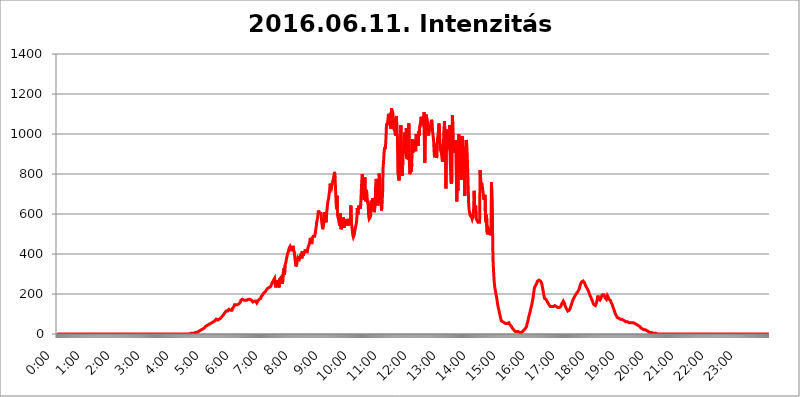
| Category | 2016.06.11. Intenzitás [W/m^2] |
|---|---|
| 0.0 | 0 |
| 0.0006944444444444445 | 0 |
| 0.001388888888888889 | 0 |
| 0.0020833333333333333 | 0 |
| 0.002777777777777778 | 0 |
| 0.003472222222222222 | 0 |
| 0.004166666666666667 | 0 |
| 0.004861111111111111 | 0 |
| 0.005555555555555556 | 0 |
| 0.0062499999999999995 | 0 |
| 0.006944444444444444 | 0 |
| 0.007638888888888889 | 0 |
| 0.008333333333333333 | 0 |
| 0.009027777777777779 | 0 |
| 0.009722222222222222 | 0 |
| 0.010416666666666666 | 0 |
| 0.011111111111111112 | 0 |
| 0.011805555555555555 | 0 |
| 0.012499999999999999 | 0 |
| 0.013194444444444444 | 0 |
| 0.013888888888888888 | 0 |
| 0.014583333333333332 | 0 |
| 0.015277777777777777 | 0 |
| 0.015972222222222224 | 0 |
| 0.016666666666666666 | 0 |
| 0.017361111111111112 | 0 |
| 0.018055555555555557 | 0 |
| 0.01875 | 0 |
| 0.019444444444444445 | 0 |
| 0.02013888888888889 | 0 |
| 0.020833333333333332 | 0 |
| 0.02152777777777778 | 0 |
| 0.022222222222222223 | 0 |
| 0.02291666666666667 | 0 |
| 0.02361111111111111 | 0 |
| 0.024305555555555556 | 0 |
| 0.024999999999999998 | 0 |
| 0.025694444444444447 | 0 |
| 0.02638888888888889 | 0 |
| 0.027083333333333334 | 0 |
| 0.027777777777777776 | 0 |
| 0.02847222222222222 | 0 |
| 0.029166666666666664 | 0 |
| 0.029861111111111113 | 0 |
| 0.030555555555555555 | 0 |
| 0.03125 | 0 |
| 0.03194444444444445 | 0 |
| 0.03263888888888889 | 0 |
| 0.03333333333333333 | 0 |
| 0.034027777777777775 | 0 |
| 0.034722222222222224 | 0 |
| 0.035416666666666666 | 0 |
| 0.036111111111111115 | 0 |
| 0.03680555555555556 | 0 |
| 0.0375 | 0 |
| 0.03819444444444444 | 0 |
| 0.03888888888888889 | 0 |
| 0.03958333333333333 | 0 |
| 0.04027777777777778 | 0 |
| 0.04097222222222222 | 0 |
| 0.041666666666666664 | 0 |
| 0.042361111111111106 | 0 |
| 0.04305555555555556 | 0 |
| 0.043750000000000004 | 0 |
| 0.044444444444444446 | 0 |
| 0.04513888888888889 | 0 |
| 0.04583333333333334 | 0 |
| 0.04652777777777778 | 0 |
| 0.04722222222222222 | 0 |
| 0.04791666666666666 | 0 |
| 0.04861111111111111 | 0 |
| 0.049305555555555554 | 0 |
| 0.049999999999999996 | 0 |
| 0.05069444444444445 | 0 |
| 0.051388888888888894 | 0 |
| 0.052083333333333336 | 0 |
| 0.05277777777777778 | 0 |
| 0.05347222222222222 | 0 |
| 0.05416666666666667 | 0 |
| 0.05486111111111111 | 0 |
| 0.05555555555555555 | 0 |
| 0.05625 | 0 |
| 0.05694444444444444 | 0 |
| 0.057638888888888885 | 0 |
| 0.05833333333333333 | 0 |
| 0.05902777777777778 | 0 |
| 0.059722222222222225 | 0 |
| 0.06041666666666667 | 0 |
| 0.061111111111111116 | 0 |
| 0.06180555555555556 | 0 |
| 0.0625 | 0 |
| 0.06319444444444444 | 0 |
| 0.06388888888888888 | 0 |
| 0.06458333333333334 | 0 |
| 0.06527777777777778 | 0 |
| 0.06597222222222222 | 0 |
| 0.06666666666666667 | 0 |
| 0.06736111111111111 | 0 |
| 0.06805555555555555 | 0 |
| 0.06874999999999999 | 0 |
| 0.06944444444444443 | 0 |
| 0.07013888888888889 | 0 |
| 0.07083333333333333 | 0 |
| 0.07152777777777779 | 0 |
| 0.07222222222222223 | 0 |
| 0.07291666666666667 | 0 |
| 0.07361111111111111 | 0 |
| 0.07430555555555556 | 0 |
| 0.075 | 0 |
| 0.07569444444444444 | 0 |
| 0.0763888888888889 | 0 |
| 0.07708333333333334 | 0 |
| 0.07777777777777778 | 0 |
| 0.07847222222222222 | 0 |
| 0.07916666666666666 | 0 |
| 0.0798611111111111 | 0 |
| 0.08055555555555556 | 0 |
| 0.08125 | 0 |
| 0.08194444444444444 | 0 |
| 0.08263888888888889 | 0 |
| 0.08333333333333333 | 0 |
| 0.08402777777777777 | 0 |
| 0.08472222222222221 | 0 |
| 0.08541666666666665 | 0 |
| 0.08611111111111112 | 0 |
| 0.08680555555555557 | 0 |
| 0.08750000000000001 | 0 |
| 0.08819444444444445 | 0 |
| 0.08888888888888889 | 0 |
| 0.08958333333333333 | 0 |
| 0.09027777777777778 | 0 |
| 0.09097222222222222 | 0 |
| 0.09166666666666667 | 0 |
| 0.09236111111111112 | 0 |
| 0.09305555555555556 | 0 |
| 0.09375 | 0 |
| 0.09444444444444444 | 0 |
| 0.09513888888888888 | 0 |
| 0.09583333333333333 | 0 |
| 0.09652777777777777 | 0 |
| 0.09722222222222222 | 0 |
| 0.09791666666666667 | 0 |
| 0.09861111111111111 | 0 |
| 0.09930555555555555 | 0 |
| 0.09999999999999999 | 0 |
| 0.10069444444444443 | 0 |
| 0.1013888888888889 | 0 |
| 0.10208333333333335 | 0 |
| 0.10277777777777779 | 0 |
| 0.10347222222222223 | 0 |
| 0.10416666666666667 | 0 |
| 0.10486111111111111 | 0 |
| 0.10555555555555556 | 0 |
| 0.10625 | 0 |
| 0.10694444444444444 | 0 |
| 0.1076388888888889 | 0 |
| 0.10833333333333334 | 0 |
| 0.10902777777777778 | 0 |
| 0.10972222222222222 | 0 |
| 0.1111111111111111 | 0 |
| 0.11180555555555556 | 0 |
| 0.11180555555555556 | 0 |
| 0.1125 | 0 |
| 0.11319444444444444 | 0 |
| 0.11388888888888889 | 0 |
| 0.11458333333333333 | 0 |
| 0.11527777777777777 | 0 |
| 0.11597222222222221 | 0 |
| 0.11666666666666665 | 0 |
| 0.1173611111111111 | 0 |
| 0.11805555555555557 | 0 |
| 0.11944444444444445 | 0 |
| 0.12013888888888889 | 0 |
| 0.12083333333333333 | 0 |
| 0.12152777777777778 | 0 |
| 0.12222222222222223 | 0 |
| 0.12291666666666667 | 0 |
| 0.12291666666666667 | 0 |
| 0.12361111111111112 | 0 |
| 0.12430555555555556 | 0 |
| 0.125 | 0 |
| 0.12569444444444444 | 0 |
| 0.12638888888888888 | 0 |
| 0.12708333333333333 | 0 |
| 0.16875 | 0 |
| 0.12847222222222224 | 0 |
| 0.12916666666666668 | 0 |
| 0.12986111111111112 | 0 |
| 0.13055555555555556 | 0 |
| 0.13125 | 0 |
| 0.13194444444444445 | 0 |
| 0.1326388888888889 | 0 |
| 0.13333333333333333 | 0 |
| 0.13402777777777777 | 0 |
| 0.13402777777777777 | 0 |
| 0.13472222222222222 | 0 |
| 0.13541666666666666 | 0 |
| 0.1361111111111111 | 0 |
| 0.13749999999999998 | 0 |
| 0.13819444444444443 | 0 |
| 0.1388888888888889 | 0 |
| 0.13958333333333334 | 0 |
| 0.14027777777777778 | 0 |
| 0.14097222222222222 | 0 |
| 0.14166666666666666 | 0 |
| 0.1423611111111111 | 0 |
| 0.14305555555555557 | 0 |
| 0.14375000000000002 | 0 |
| 0.14444444444444446 | 0 |
| 0.1451388888888889 | 0 |
| 0.1451388888888889 | 0 |
| 0.14652777777777778 | 0 |
| 0.14722222222222223 | 0 |
| 0.14791666666666667 | 0 |
| 0.1486111111111111 | 0 |
| 0.14930555555555555 | 0 |
| 0.15 | 0 |
| 0.15069444444444444 | 0 |
| 0.15138888888888888 | 0 |
| 0.15208333333333332 | 0 |
| 0.15277777777777776 | 0 |
| 0.15347222222222223 | 0 |
| 0.15416666666666667 | 0 |
| 0.15486111111111112 | 0 |
| 0.15555555555555556 | 0 |
| 0.15625 | 0 |
| 0.15694444444444444 | 0 |
| 0.15763888888888888 | 0 |
| 0.15833333333333333 | 0 |
| 0.15902777777777777 | 0 |
| 0.15972222222222224 | 0 |
| 0.16041666666666668 | 0 |
| 0.16111111111111112 | 0 |
| 0.16180555555555556 | 0 |
| 0.1625 | 0 |
| 0.16319444444444445 | 0 |
| 0.1638888888888889 | 0 |
| 0.16458333333333333 | 0 |
| 0.16527777777777777 | 0 |
| 0.16597222222222222 | 0 |
| 0.16666666666666666 | 0 |
| 0.1673611111111111 | 0 |
| 0.16805555555555554 | 0 |
| 0.16874999999999998 | 0 |
| 0.16944444444444443 | 0 |
| 0.17013888888888887 | 0 |
| 0.1708333333333333 | 0 |
| 0.17152777777777775 | 0 |
| 0.17222222222222225 | 0 |
| 0.1729166666666667 | 0 |
| 0.17361111111111113 | 0 |
| 0.17430555555555557 | 0 |
| 0.17500000000000002 | 0 |
| 0.17569444444444446 | 0 |
| 0.1763888888888889 | 0 |
| 0.17708333333333334 | 0 |
| 0.17777777777777778 | 0 |
| 0.17847222222222223 | 0 |
| 0.17916666666666667 | 0 |
| 0.1798611111111111 | 0 |
| 0.18055555555555555 | 0 |
| 0.18125 | 0 |
| 0.18194444444444444 | 0 |
| 0.1826388888888889 | 0 |
| 0.18333333333333335 | 0 |
| 0.1840277777777778 | 0 |
| 0.18472222222222223 | 0 |
| 0.18541666666666667 | 0 |
| 0.18611111111111112 | 0 |
| 0.18680555555555556 | 3.525 |
| 0.1875 | 3.525 |
| 0.18819444444444444 | 3.525 |
| 0.18888888888888888 | 3.525 |
| 0.18958333333333333 | 3.525 |
| 0.19027777777777777 | 3.525 |
| 0.1909722222222222 | 3.525 |
| 0.19166666666666665 | 3.525 |
| 0.19236111111111112 | 3.525 |
| 0.19305555555555554 | 7.887 |
| 0.19375 | 7.887 |
| 0.19444444444444445 | 7.887 |
| 0.1951388888888889 | 7.887 |
| 0.19583333333333333 | 7.887 |
| 0.19652777777777777 | 12.257 |
| 0.19722222222222222 | 12.257 |
| 0.19791666666666666 | 12.257 |
| 0.1986111111111111 | 12.257 |
| 0.19930555555555554 | 16.636 |
| 0.19999999999999998 | 16.636 |
| 0.20069444444444443 | 16.636 |
| 0.20138888888888887 | 21.024 |
| 0.2020833333333333 | 21.024 |
| 0.2027777777777778 | 21.024 |
| 0.2034722222222222 | 21.024 |
| 0.2041666666666667 | 25.419 |
| 0.20486111111111113 | 25.419 |
| 0.20555555555555557 | 29.823 |
| 0.20625000000000002 | 29.823 |
| 0.20694444444444446 | 34.234 |
| 0.2076388888888889 | 34.234 |
| 0.20833333333333334 | 38.653 |
| 0.20902777777777778 | 38.653 |
| 0.20972222222222223 | 43.079 |
| 0.21041666666666667 | 43.079 |
| 0.2111111111111111 | 47.511 |
| 0.21180555555555555 | 47.511 |
| 0.2125 | 47.511 |
| 0.21319444444444444 | 51.951 |
| 0.2138888888888889 | 51.951 |
| 0.21458333333333335 | 51.951 |
| 0.2152777777777778 | 51.951 |
| 0.21597222222222223 | 56.398 |
| 0.21666666666666667 | 56.398 |
| 0.21736111111111112 | 56.398 |
| 0.21805555555555556 | 56.398 |
| 0.21875 | 60.85 |
| 0.21944444444444444 | 65.31 |
| 0.22013888888888888 | 65.31 |
| 0.22083333333333333 | 65.31 |
| 0.22152777777777777 | 69.775 |
| 0.2222222222222222 | 69.775 |
| 0.22291666666666665 | 74.246 |
| 0.2236111111111111 | 69.775 |
| 0.22430555555555556 | 69.775 |
| 0.225 | 69.775 |
| 0.22569444444444445 | 74.246 |
| 0.2263888888888889 | 74.246 |
| 0.22708333333333333 | 74.246 |
| 0.22777777777777777 | 74.246 |
| 0.22847222222222222 | 74.246 |
| 0.22916666666666666 | 78.722 |
| 0.2298611111111111 | 78.722 |
| 0.23055555555555554 | 83.205 |
| 0.23124999999999998 | 87.692 |
| 0.23194444444444443 | 92.184 |
| 0.23263888888888887 | 92.184 |
| 0.2333333333333333 | 96.682 |
| 0.2340277777777778 | 101.184 |
| 0.2347222222222222 | 105.69 |
| 0.2354166666666667 | 110.201 |
| 0.23611111111111113 | 110.201 |
| 0.23680555555555557 | 114.716 |
| 0.23750000000000002 | 114.716 |
| 0.23819444444444446 | 119.235 |
| 0.2388888888888889 | 114.716 |
| 0.23958333333333334 | 114.716 |
| 0.24027777777777778 | 119.235 |
| 0.24097222222222223 | 123.758 |
| 0.24166666666666667 | 119.235 |
| 0.2423611111111111 | 119.235 |
| 0.24305555555555555 | 119.235 |
| 0.24375 | 123.758 |
| 0.24444444444444446 | 123.758 |
| 0.24513888888888888 | 119.235 |
| 0.24583333333333335 | 128.284 |
| 0.2465277777777778 | 132.814 |
| 0.24722222222222223 | 132.814 |
| 0.24791666666666667 | 137.347 |
| 0.24861111111111112 | 146.423 |
| 0.24930555555555556 | 146.423 |
| 0.25 | 146.423 |
| 0.25069444444444444 | 146.423 |
| 0.2513888888888889 | 146.423 |
| 0.2520833333333333 | 146.423 |
| 0.25277777777777777 | 146.423 |
| 0.2534722222222222 | 146.423 |
| 0.25416666666666665 | 150.964 |
| 0.2548611111111111 | 150.964 |
| 0.2555555555555556 | 150.964 |
| 0.25625000000000003 | 155.509 |
| 0.2569444444444445 | 160.056 |
| 0.2576388888888889 | 169.156 |
| 0.25833333333333336 | 173.709 |
| 0.2590277777777778 | 173.709 |
| 0.25972222222222224 | 173.709 |
| 0.2604166666666667 | 173.709 |
| 0.2611111111111111 | 169.156 |
| 0.26180555555555557 | 169.156 |
| 0.2625 | 164.605 |
| 0.26319444444444445 | 169.156 |
| 0.2638888888888889 | 169.156 |
| 0.26458333333333334 | 169.156 |
| 0.2652777777777778 | 169.156 |
| 0.2659722222222222 | 169.156 |
| 0.26666666666666666 | 169.156 |
| 0.2673611111111111 | 169.156 |
| 0.26805555555555555 | 173.709 |
| 0.26875 | 173.709 |
| 0.26944444444444443 | 173.709 |
| 0.2701388888888889 | 173.709 |
| 0.2708333333333333 | 169.156 |
| 0.27152777777777776 | 169.156 |
| 0.2722222222222222 | 169.156 |
| 0.27291666666666664 | 169.156 |
| 0.2736111111111111 | 164.605 |
| 0.2743055555555555 | 160.056 |
| 0.27499999999999997 | 155.509 |
| 0.27569444444444446 | 160.056 |
| 0.27638888888888885 | 164.605 |
| 0.27708333333333335 | 164.605 |
| 0.2777777777777778 | 164.605 |
| 0.27847222222222223 | 164.605 |
| 0.2791666666666667 | 160.056 |
| 0.2798611111111111 | 155.509 |
| 0.28055555555555556 | 160.056 |
| 0.28125 | 164.605 |
| 0.28194444444444444 | 169.156 |
| 0.2826388888888889 | 169.156 |
| 0.2833333333333333 | 173.709 |
| 0.28402777777777777 | 178.264 |
| 0.2847222222222222 | 169.156 |
| 0.28541666666666665 | 178.264 |
| 0.28611111111111115 | 187.378 |
| 0.28680555555555554 | 191.937 |
| 0.28750000000000003 | 191.937 |
| 0.2881944444444445 | 196.497 |
| 0.2888888888888889 | 201.058 |
| 0.28958333333333336 | 205.62 |
| 0.2902777777777778 | 210.182 |
| 0.29097222222222224 | 210.182 |
| 0.2916666666666667 | 210.182 |
| 0.2923611111111111 | 210.182 |
| 0.29305555555555557 | 219.309 |
| 0.29375 | 219.309 |
| 0.29444444444444445 | 223.873 |
| 0.2951388888888889 | 228.436 |
| 0.29583333333333334 | 233 |
| 0.2965277777777778 | 233 |
| 0.2972222222222222 | 233 |
| 0.29791666666666666 | 233 |
| 0.2986111111111111 | 233 |
| 0.29930555555555555 | 237.564 |
| 0.3 | 242.127 |
| 0.30069444444444443 | 251.251 |
| 0.3013888888888889 | 255.813 |
| 0.3020833333333333 | 260.373 |
| 0.30277777777777776 | 264.932 |
| 0.3034722222222222 | 269.49 |
| 0.30416666666666664 | 274.047 |
| 0.3048611111111111 | 278.603 |
| 0.3055555555555555 | 274.047 |
| 0.30624999999999997 | 233 |
| 0.3069444444444444 | 228.436 |
| 0.3076388888888889 | 269.49 |
| 0.30833333333333335 | 255.813 |
| 0.3090277777777778 | 264.932 |
| 0.30972222222222223 | 264.932 |
| 0.3104166666666667 | 269.49 |
| 0.3111111111111111 | 233 |
| 0.31180555555555556 | 274.047 |
| 0.3125 | 274.047 |
| 0.31319444444444444 | 278.603 |
| 0.3138888888888889 | 283.156 |
| 0.3145833333333333 | 269.49 |
| 0.31527777777777777 | 269.49 |
| 0.3159722222222222 | 251.251 |
| 0.31666666666666665 | 296.808 |
| 0.31736111111111115 | 314.98 |
| 0.31805555555555554 | 328.584 |
| 0.31875000000000003 | 296.808 |
| 0.3194444444444445 | 342.162 |
| 0.3201388888888889 | 346.682 |
| 0.32083333333333336 | 360.221 |
| 0.3215277777777778 | 378.224 |
| 0.32222222222222224 | 387.202 |
| 0.3229166666666667 | 400.638 |
| 0.3236111111111111 | 400.638 |
| 0.32430555555555557 | 414.035 |
| 0.325 | 427.39 |
| 0.32569444444444445 | 427.39 |
| 0.3263888888888889 | 436.27 |
| 0.32708333333333334 | 427.39 |
| 0.3277777777777778 | 414.035 |
| 0.3284722222222222 | 427.39 |
| 0.32916666666666666 | 418.492 |
| 0.3298611111111111 | 422.943 |
| 0.33055555555555555 | 440.702 |
| 0.33125 | 427.39 |
| 0.33194444444444443 | 427.39 |
| 0.3326388888888889 | 405.108 |
| 0.3333333333333333 | 378.224 |
| 0.3340277777777778 | 382.715 |
| 0.3347222222222222 | 337.639 |
| 0.3354166666666667 | 342.162 |
| 0.3361111111111111 | 351.198 |
| 0.3368055555555556 | 373.729 |
| 0.33749999999999997 | 382.715 |
| 0.33819444444444446 | 382.715 |
| 0.33888888888888885 | 378.224 |
| 0.33958333333333335 | 373.729 |
| 0.34027777777777773 | 373.729 |
| 0.34097222222222223 | 373.729 |
| 0.3416666666666666 | 396.164 |
| 0.3423611111111111 | 405.108 |
| 0.3430555555555555 | 378.224 |
| 0.34375 | 414.035 |
| 0.3444444444444445 | 414.035 |
| 0.3451388888888889 | 391.685 |
| 0.3458333333333334 | 405.108 |
| 0.34652777777777777 | 405.108 |
| 0.34722222222222227 | 414.035 |
| 0.34791666666666665 | 422.943 |
| 0.34861111111111115 | 409.574 |
| 0.34930555555555554 | 418.492 |
| 0.35000000000000003 | 405.108 |
| 0.3506944444444444 | 418.492 |
| 0.3513888888888889 | 422.943 |
| 0.3520833333333333 | 436.27 |
| 0.3527777777777778 | 440.702 |
| 0.3534722222222222 | 449.551 |
| 0.3541666666666667 | 458.38 |
| 0.3548611111111111 | 480.356 |
| 0.35555555555555557 | 471.582 |
| 0.35625 | 462.786 |
| 0.35694444444444445 | 449.551 |
| 0.3576388888888889 | 480.356 |
| 0.35833333333333334 | 484.735 |
| 0.3590277777777778 | 489.108 |
| 0.3597222222222222 | 489.108 |
| 0.36041666666666666 | 484.735 |
| 0.3611111111111111 | 489.108 |
| 0.36180555555555555 | 502.192 |
| 0.3625 | 506.542 |
| 0.36319444444444443 | 536.82 |
| 0.3638888888888889 | 558.261 |
| 0.3645833333333333 | 558.261 |
| 0.3652777777777778 | 583.779 |
| 0.3659722222222222 | 609.062 |
| 0.3666666666666667 | 617.436 |
| 0.3673611111111111 | 600.661 |
| 0.3680555555555556 | 609.062 |
| 0.36874999999999997 | 596.45 |
| 0.36944444444444446 | 609.062 |
| 0.37013888888888885 | 596.45 |
| 0.37083333333333335 | 562.53 |
| 0.37152777777777773 | 545.416 |
| 0.37222222222222223 | 523.88 |
| 0.3729166666666666 | 523.88 |
| 0.3736111111111111 | 553.986 |
| 0.3743055555555555 | 575.299 |
| 0.375 | 609.062 |
| 0.3756944444444445 | 600.661 |
| 0.3763888888888889 | 571.049 |
| 0.3770833333333334 | 558.261 |
| 0.37777777777777777 | 600.661 |
| 0.37847222222222227 | 625.784 |
| 0.37916666666666665 | 650.667 |
| 0.37986111111111115 | 667.123 |
| 0.38055555555555554 | 675.311 |
| 0.38125000000000003 | 699.717 |
| 0.3819444444444444 | 711.832 |
| 0.3826388888888889 | 751.803 |
| 0.3833333333333333 | 751.803 |
| 0.3840277777777778 | 747.834 |
| 0.3847222222222222 | 731.896 |
| 0.3854166666666667 | 735.89 |
| 0.3861111111111111 | 759.723 |
| 0.38680555555555557 | 759.723 |
| 0.3875 | 779.42 |
| 0.38819444444444445 | 795.074 |
| 0.3888888888888889 | 810.641 |
| 0.38958333333333334 | 779.42 |
| 0.3902777777777778 | 731.896 |
| 0.3909722222222222 | 663.019 |
| 0.39166666666666666 | 625.784 |
| 0.3923611111111111 | 691.608 |
| 0.39305555555555555 | 596.45 |
| 0.39375 | 583.779 |
| 0.39444444444444443 | 575.299 |
| 0.3951388888888889 | 558.261 |
| 0.3958333333333333 | 553.986 |
| 0.3965277777777778 | 541.121 |
| 0.3972222222222222 | 604.864 |
| 0.3979166666666667 | 523.88 |
| 0.3986111111111111 | 528.2 |
| 0.3993055555555556 | 528.2 |
| 0.39999999999999997 | 545.416 |
| 0.40069444444444446 | 549.704 |
| 0.40138888888888885 | 583.779 |
| 0.40208333333333335 | 532.513 |
| 0.40277777777777773 | 536.82 |
| 0.40347222222222223 | 545.416 |
| 0.4041666666666666 | 558.261 |
| 0.4048611111111111 | 566.793 |
| 0.4055555555555555 | 575.299 |
| 0.40625 | 562.53 |
| 0.4069444444444445 | 558.261 |
| 0.4076388888888889 | 541.121 |
| 0.4083333333333334 | 536.82 |
| 0.40902777777777777 | 541.121 |
| 0.40972222222222227 | 575.299 |
| 0.41041666666666665 | 562.53 |
| 0.41111111111111115 | 571.049 |
| 0.41180555555555554 | 642.4 |
| 0.41250000000000003 | 549.704 |
| 0.4131944444444444 | 541.121 |
| 0.4138888888888889 | 541.121 |
| 0.4145833333333333 | 493.475 |
| 0.4152777777777778 | 484.735 |
| 0.4159722222222222 | 489.108 |
| 0.4166666666666667 | 497.836 |
| 0.4173611111111111 | 515.223 |
| 0.41805555555555557 | 528.2 |
| 0.41875 | 541.121 |
| 0.41944444444444445 | 553.986 |
| 0.4201388888888889 | 575.299 |
| 0.42083333333333334 | 629.948 |
| 0.4215277777777778 | 596.45 |
| 0.4222222222222222 | 613.252 |
| 0.42291666666666666 | 642.4 |
| 0.4236111111111111 | 625.784 |
| 0.42430555555555555 | 638.256 |
| 0.425 | 625.784 |
| 0.42569444444444443 | 650.667 |
| 0.4263888888888889 | 711.832 |
| 0.4270833333333333 | 763.674 |
| 0.4277777777777778 | 798.974 |
| 0.4284722222222222 | 798.974 |
| 0.4291666666666667 | 739.877 |
| 0.4298611111111111 | 683.473 |
| 0.4305555555555556 | 671.22 |
| 0.43124999999999997 | 783.342 |
| 0.43194444444444446 | 755.766 |
| 0.43263888888888885 | 663.019 |
| 0.43333333333333335 | 719.877 |
| 0.43402777777777773 | 711.832 |
| 0.43472222222222223 | 675.311 |
| 0.4354166666666666 | 654.791 |
| 0.4361111111111111 | 642.4 |
| 0.4368055555555555 | 588.009 |
| 0.4375 | 575.299 |
| 0.4381944444444445 | 575.299 |
| 0.4388888888888889 | 583.779 |
| 0.4395833333333334 | 592.233 |
| 0.44027777777777777 | 667.123 |
| 0.44097222222222227 | 629.948 |
| 0.44166666666666665 | 617.436 |
| 0.44236111111111115 | 679.395 |
| 0.44305555555555554 | 667.123 |
| 0.44375000000000003 | 638.256 |
| 0.4444444444444444 | 609.062 |
| 0.4451388888888889 | 621.613 |
| 0.4458333333333333 | 642.4 |
| 0.4465277777777778 | 735.89 |
| 0.4472222222222222 | 775.492 |
| 0.4479166666666667 | 775.492 |
| 0.4486111111111111 | 735.89 |
| 0.44930555555555557 | 642.4 |
| 0.45 | 658.909 |
| 0.45069444444444445 | 671.22 |
| 0.4513888888888889 | 802.868 |
| 0.45208333333333334 | 787.258 |
| 0.4527777777777778 | 727.896 |
| 0.4534722222222222 | 658.909 |
| 0.45416666666666666 | 642.4 |
| 0.4548611111111111 | 617.436 |
| 0.45555555555555555 | 671.22 |
| 0.45625 | 691.608 |
| 0.45694444444444443 | 829.981 |
| 0.4576388888888889 | 860.676 |
| 0.4583333333333333 | 902.447 |
| 0.4590277777777778 | 932.576 |
| 0.4597222222222222 | 925.06 |
| 0.4604166666666667 | 940.082 |
| 0.4611111111111111 | 984.98 |
| 0.4618055555555556 | 1052.255 |
| 0.46249999999999997 | 1044.762 |
| 0.46319444444444446 | 1052.255 |
| 0.46388888888888885 | 1074.789 |
| 0.46458333333333335 | 1101.226 |
| 0.46527777777777773 | 1097.437 |
| 0.46597222222222223 | 1074.789 |
| 0.4666666666666666 | 1097.437 |
| 0.4673611111111111 | 1033.537 |
| 0.4680555555555555 | 1026.06 |
| 0.46875 | 1127.879 |
| 0.4694444444444445 | 1127.879 |
| 0.4701388888888889 | 1127.879 |
| 0.4708333333333334 | 1101.226 |
| 0.47152777777777777 | 1033.537 |
| 0.47222222222222227 | 1033.537 |
| 0.47291666666666665 | 1014.852 |
| 0.47361111111111115 | 1048.508 |
| 0.47430555555555554 | 992.448 |
| 0.47500000000000003 | 1082.324 |
| 0.4756944444444444 | 1089.873 |
| 0.4763888888888889 | 1011.118 |
| 0.4770833333333333 | 988.714 |
| 0.4777777777777778 | 806.757 |
| 0.4784722222222222 | 806.757 |
| 0.4791666666666667 | 767.62 |
| 0.4798611111111111 | 779.42 |
| 0.48055555555555557 | 837.682 |
| 0.48125 | 898.668 |
| 0.48194444444444445 | 1044.762 |
| 0.4826388888888889 | 853.029 |
| 0.48333333333333334 | 868.305 |
| 0.4840277777777778 | 791.169 |
| 0.4847222222222222 | 887.309 |
| 0.48541666666666666 | 898.668 |
| 0.4861111111111111 | 940.082 |
| 0.48680555555555555 | 943.832 |
| 0.4875 | 1007.383 |
| 0.48819444444444443 | 928.819 |
| 0.4888888888888889 | 977.508 |
| 0.4895833333333333 | 1029.798 |
| 0.4902777777777778 | 875.918 |
| 0.4909722222222222 | 921.298 |
| 0.4916666666666667 | 917.534 |
| 0.4923611111111111 | 872.114 |
| 0.4930555555555556 | 1052.255 |
| 0.49374999999999997 | 875.918 |
| 0.49444444444444446 | 798.974 |
| 0.49513888888888885 | 798.974 |
| 0.49583333333333335 | 818.392 |
| 0.49652777777777773 | 810.641 |
| 0.49722222222222223 | 849.199 |
| 0.4979166666666666 | 973.772 |
| 0.4986111111111111 | 906.223 |
| 0.4993055555555555 | 921.298 |
| 0.5 | 962.555 |
| 0.5006944444444444 | 970.034 |
| 0.5013888888888889 | 932.576 |
| 0.5020833333333333 | 921.298 |
| 0.5027777777777778 | 913.766 |
| 0.5034722222222222 | 999.916 |
| 0.5041666666666667 | 977.508 |
| 0.5048611111111111 | 992.448 |
| 0.5055555555555555 | 981.244 |
| 0.50625 | 940.082 |
| 0.5069444444444444 | 1014.852 |
| 0.5076388888888889 | 992.448 |
| 0.5083333333333333 | 1037.277 |
| 0.5090277777777777 | 1048.508 |
| 0.5097222222222222 | 1063.51 |
| 0.5104166666666666 | 1086.097 |
| 0.5111111111111112 | 1059.756 |
| 0.5118055555555555 | 1052.255 |
| 0.5125000000000001 | 1048.508 |
| 0.5131944444444444 | 1063.51 |
| 0.513888888888889 | 1078.555 |
| 0.5145833333333333 | 1108.816 |
| 0.5152777777777778 | 856.855 |
| 0.5159722222222222 | 879.719 |
| 0.5166666666666667 | 1067.267 |
| 0.517361111111111 | 1097.437 |
| 0.5180555555555556 | 1101.226 |
| 0.5187499999999999 | 1067.267 |
| 0.5194444444444445 | 1059.756 |
| 0.5201388888888888 | 1041.019 |
| 0.5208333333333334 | 992.448 |
| 0.5215277777777778 | 988.714 |
| 0.5222222222222223 | 1041.019 |
| 0.5229166666666667 | 1014.852 |
| 0.5236111111111111 | 1037.277 |
| 0.5243055555555556 | 1059.756 |
| 0.525 | 1071.027 |
| 0.5256944444444445 | 1059.756 |
| 0.5263888888888889 | 1014.852 |
| 0.5270833333333333 | 992.448 |
| 0.5277777777777778 | 970.034 |
| 0.5284722222222222 | 917.534 |
| 0.5291666666666667 | 883.516 |
| 0.5298611111111111 | 925.06 |
| 0.5305555555555556 | 932.576 |
| 0.53125 | 921.298 |
| 0.5319444444444444 | 879.719 |
| 0.5326388888888889 | 894.885 |
| 0.5333333333333333 | 977.508 |
| 0.5340277777777778 | 992.448 |
| 0.5347222222222222 | 1018.587 |
| 0.5354166666666667 | 1052.255 |
| 0.5361111111111111 | 1014.852 |
| 0.5368055555555555 | 958.814 |
| 0.5375 | 921.298 |
| 0.5381944444444444 | 925.06 |
| 0.5388888888888889 | 902.447 |
| 0.5395833333333333 | 906.223 |
| 0.5402777777777777 | 860.676 |
| 0.5409722222222222 | 947.58 |
| 0.5416666666666666 | 955.071 |
| 0.5423611111111112 | 1022.323 |
| 0.5430555555555555 | 1063.51 |
| 0.5437500000000001 | 1059.756 |
| 0.5444444444444444 | 921.298 |
| 0.545138888888889 | 727.896 |
| 0.5458333333333333 | 999.916 |
| 0.5465277777777778 | 1022.323 |
| 0.5472222222222222 | 1022.323 |
| 0.5479166666666667 | 1003.65 |
| 0.548611111111111 | 932.576 |
| 0.5493055555555556 | 936.33 |
| 0.5499999999999999 | 940.082 |
| 0.5506944444444445 | 1044.762 |
| 0.5513888888888888 | 853.029 |
| 0.5520833333333334 | 759.723 |
| 0.5527777777777778 | 751.803 |
| 0.5534722222222223 | 767.62 |
| 0.5541666666666667 | 1093.653 |
| 0.5548611111111111 | 1037.277 |
| 0.5555555555555556 | 970.034 |
| 0.55625 | 906.223 |
| 0.5569444444444445 | 962.555 |
| 0.5576388888888889 | 921.298 |
| 0.5583333333333333 | 970.034 |
| 0.5590277777777778 | 936.33 |
| 0.5597222222222222 | 787.258 |
| 0.5604166666666667 | 663.019 |
| 0.5611111111111111 | 917.534 |
| 0.5618055555555556 | 715.858 |
| 0.5625 | 860.676 |
| 0.5631944444444444 | 999.916 |
| 0.5638888888888889 | 917.534 |
| 0.5645833333333333 | 984.98 |
| 0.5652777777777778 | 822.26 |
| 0.5659722222222222 | 879.719 |
| 0.5666666666666667 | 771.559 |
| 0.5673611111111111 | 898.668 |
| 0.5680555555555555 | 988.714 |
| 0.56875 | 947.58 |
| 0.5694444444444444 | 932.576 |
| 0.5701388888888889 | 795.074 |
| 0.5708333333333333 | 932.576 |
| 0.5715277777777777 | 691.608 |
| 0.5722222222222222 | 818.392 |
| 0.5729166666666666 | 787.258 |
| 0.5736111111111112 | 970.034 |
| 0.5743055555555555 | 947.58 |
| 0.5750000000000001 | 894.885 |
| 0.5756944444444444 | 894.885 |
| 0.576388888888889 | 894.885 |
| 0.5770833333333333 | 642.4 |
| 0.5777777777777778 | 617.436 |
| 0.5784722222222222 | 604.864 |
| 0.5791666666666667 | 592.233 |
| 0.579861111111111 | 592.233 |
| 0.5805555555555556 | 592.233 |
| 0.5812499999999999 | 583.779 |
| 0.5819444444444445 | 575.299 |
| 0.5826388888888888 | 583.779 |
| 0.5833333333333334 | 600.661 |
| 0.5840277777777778 | 625.784 |
| 0.5847222222222223 | 715.858 |
| 0.5854166666666667 | 634.105 |
| 0.5861111111111111 | 617.436 |
| 0.5868055555555556 | 642.4 |
| 0.5875 | 579.542 |
| 0.5881944444444445 | 571.049 |
| 0.5888888888888889 | 571.049 |
| 0.5895833333333333 | 566.793 |
| 0.5902777777777778 | 558.261 |
| 0.5909722222222222 | 553.986 |
| 0.5916666666666667 | 553.986 |
| 0.5923611111111111 | 558.261 |
| 0.5930555555555556 | 818.392 |
| 0.59375 | 783.342 |
| 0.5944444444444444 | 743.859 |
| 0.5951388888888889 | 755.766 |
| 0.5958333333333333 | 743.859 |
| 0.5965277777777778 | 727.896 |
| 0.5972222222222222 | 707.8 |
| 0.5979166666666667 | 683.473 |
| 0.5986111111111111 | 671.22 |
| 0.5993055555555555 | 667.123 |
| 0.6 | 695.666 |
| 0.6006944444444444 | 571.049 |
| 0.6013888888888889 | 558.261 |
| 0.6020833333333333 | 596.45 |
| 0.6027777777777777 | 510.885 |
| 0.6034722222222222 | 497.836 |
| 0.6041666666666666 | 506.542 |
| 0.6048611111111112 | 523.88 |
| 0.6055555555555555 | 523.88 |
| 0.6062500000000001 | 519.555 |
| 0.6069444444444444 | 506.542 |
| 0.607638888888889 | 493.475 |
| 0.6083333333333333 | 515.223 |
| 0.6090277777777778 | 759.723 |
| 0.6097222222222222 | 759.723 |
| 0.6104166666666667 | 558.261 |
| 0.611111111111111 | 378.224 |
| 0.6118055555555556 | 324.052 |
| 0.6124999999999999 | 278.603 |
| 0.6131944444444445 | 246.689 |
| 0.6138888888888888 | 228.436 |
| 0.6145833333333334 | 214.746 |
| 0.6152777777777778 | 201.058 |
| 0.6159722222222223 | 187.378 |
| 0.6166666666666667 | 173.709 |
| 0.6173611111111111 | 155.509 |
| 0.6180555555555556 | 141.884 |
| 0.61875 | 128.284 |
| 0.6194444444444445 | 119.235 |
| 0.6201388888888889 | 105.69 |
| 0.6208333333333333 | 96.682 |
| 0.6215277777777778 | 83.205 |
| 0.6222222222222222 | 74.246 |
| 0.6229166666666667 | 65.31 |
| 0.6236111111111111 | 60.85 |
| 0.6243055555555556 | 60.85 |
| 0.625 | 60.85 |
| 0.6256944444444444 | 56.398 |
| 0.6263888888888889 | 56.398 |
| 0.6270833333333333 | 56.398 |
| 0.6277777777777778 | 56.398 |
| 0.6284722222222222 | 51.951 |
| 0.6291666666666667 | 51.951 |
| 0.6298611111111111 | 51.951 |
| 0.6305555555555555 | 47.511 |
| 0.63125 | 51.951 |
| 0.6319444444444444 | 56.398 |
| 0.6326388888888889 | 56.398 |
| 0.6333333333333333 | 56.398 |
| 0.6340277777777777 | 51.951 |
| 0.6347222222222222 | 47.511 |
| 0.6354166666666666 | 47.511 |
| 0.6361111111111112 | 43.079 |
| 0.6368055555555555 | 38.653 |
| 0.6375000000000001 | 34.234 |
| 0.6381944444444444 | 29.823 |
| 0.638888888888889 | 25.419 |
| 0.6395833333333333 | 25.419 |
| 0.6402777777777778 | 21.024 |
| 0.6409722222222222 | 21.024 |
| 0.6416666666666667 | 16.636 |
| 0.642361111111111 | 12.257 |
| 0.6430555555555556 | 12.257 |
| 0.6437499999999999 | 12.257 |
| 0.6444444444444445 | 12.257 |
| 0.6451388888888888 | 12.257 |
| 0.6458333333333334 | 12.257 |
| 0.6465277777777778 | 12.257 |
| 0.6472222222222223 | 12.257 |
| 0.6479166666666667 | 7.887 |
| 0.6486111111111111 | 7.887 |
| 0.6493055555555556 | 7.887 |
| 0.65 | 7.887 |
| 0.6506944444444445 | 7.887 |
| 0.6513888888888889 | 7.887 |
| 0.6520833333333333 | 12.257 |
| 0.6527777777777778 | 12.257 |
| 0.6534722222222222 | 16.636 |
| 0.6541666666666667 | 16.636 |
| 0.6548611111111111 | 21.024 |
| 0.6555555555555556 | 21.024 |
| 0.65625 | 25.419 |
| 0.6569444444444444 | 29.823 |
| 0.6576388888888889 | 34.234 |
| 0.6583333333333333 | 38.653 |
| 0.6590277777777778 | 51.951 |
| 0.6597222222222222 | 60.85 |
| 0.6604166666666667 | 69.775 |
| 0.6611111111111111 | 83.205 |
| 0.6618055555555555 | 92.184 |
| 0.6625 | 101.184 |
| 0.6631944444444444 | 110.201 |
| 0.6638888888888889 | 123.758 |
| 0.6645833333333333 | 132.814 |
| 0.6652777777777777 | 141.884 |
| 0.6659722222222222 | 155.509 |
| 0.6666666666666666 | 169.156 |
| 0.6673611111111111 | 182.82 |
| 0.6680555555555556 | 201.058 |
| 0.6687500000000001 | 219.309 |
| 0.6694444444444444 | 233 |
| 0.6701388888888888 | 237.564 |
| 0.6708333333333334 | 242.127 |
| 0.6715277777777778 | 246.689 |
| 0.6722222222222222 | 251.251 |
| 0.6729166666666666 | 255.813 |
| 0.6736111111111112 | 264.932 |
| 0.6743055555555556 | 264.932 |
| 0.6749999999999999 | 269.49 |
| 0.6756944444444444 | 269.49 |
| 0.6763888888888889 | 269.49 |
| 0.6770833333333334 | 269.49 |
| 0.6777777777777777 | 264.932 |
| 0.6784722222222223 | 260.373 |
| 0.6791666666666667 | 255.813 |
| 0.6798611111111111 | 246.689 |
| 0.6805555555555555 | 233 |
| 0.68125 | 219.309 |
| 0.6819444444444445 | 205.62 |
| 0.6826388888888889 | 191.937 |
| 0.6833333333333332 | 178.264 |
| 0.6840277777777778 | 178.264 |
| 0.6847222222222222 | 178.264 |
| 0.6854166666666667 | 173.709 |
| 0.686111111111111 | 173.709 |
| 0.6868055555555556 | 164.605 |
| 0.6875 | 160.056 |
| 0.6881944444444444 | 155.509 |
| 0.688888888888889 | 150.964 |
| 0.6895833333333333 | 146.423 |
| 0.6902777777777778 | 141.884 |
| 0.6909722222222222 | 141.884 |
| 0.6916666666666668 | 137.347 |
| 0.6923611111111111 | 137.347 |
| 0.6930555555555555 | 137.347 |
| 0.69375 | 137.347 |
| 0.6944444444444445 | 137.347 |
| 0.6951388888888889 | 132.814 |
| 0.6958333333333333 | 137.347 |
| 0.6965277777777777 | 137.347 |
| 0.6972222222222223 | 137.347 |
| 0.6979166666666666 | 141.884 |
| 0.6986111111111111 | 141.884 |
| 0.6993055555555556 | 141.884 |
| 0.7000000000000001 | 137.347 |
| 0.7006944444444444 | 137.347 |
| 0.7013888888888888 | 137.347 |
| 0.7020833333333334 | 132.814 |
| 0.7027777777777778 | 128.284 |
| 0.7034722222222222 | 128.284 |
| 0.7041666666666666 | 132.814 |
| 0.7048611111111112 | 132.814 |
| 0.7055555555555556 | 137.347 |
| 0.7062499999999999 | 137.347 |
| 0.7069444444444444 | 146.423 |
| 0.7076388888888889 | 150.964 |
| 0.7083333333333334 | 155.509 |
| 0.7090277777777777 | 160.056 |
| 0.7097222222222223 | 164.605 |
| 0.7104166666666667 | 160.056 |
| 0.7111111111111111 | 155.509 |
| 0.7118055555555555 | 146.423 |
| 0.7125 | 141.884 |
| 0.7131944444444445 | 132.814 |
| 0.7138888888888889 | 128.284 |
| 0.7145833333333332 | 123.758 |
| 0.7152777777777778 | 119.235 |
| 0.7159722222222222 | 114.716 |
| 0.7166666666666667 | 114.716 |
| 0.717361111111111 | 119.235 |
| 0.7180555555555556 | 119.235 |
| 0.71875 | 123.758 |
| 0.7194444444444444 | 128.284 |
| 0.720138888888889 | 137.347 |
| 0.7208333333333333 | 141.884 |
| 0.7215277777777778 | 150.964 |
| 0.7222222222222222 | 160.056 |
| 0.7229166666666668 | 164.605 |
| 0.7236111111111111 | 173.709 |
| 0.7243055555555555 | 178.264 |
| 0.725 | 182.82 |
| 0.7256944444444445 | 187.378 |
| 0.7263888888888889 | 191.937 |
| 0.7270833333333333 | 196.497 |
| 0.7277777777777777 | 201.058 |
| 0.7284722222222223 | 201.058 |
| 0.7291666666666666 | 205.62 |
| 0.7298611111111111 | 210.182 |
| 0.7305555555555556 | 210.182 |
| 0.7312500000000001 | 214.746 |
| 0.7319444444444444 | 223.873 |
| 0.7326388888888888 | 233 |
| 0.7333333333333334 | 242.127 |
| 0.7340277777777778 | 251.251 |
| 0.7347222222222222 | 255.813 |
| 0.7354166666666666 | 260.373 |
| 0.7361111111111112 | 264.932 |
| 0.7368055555555556 | 264.932 |
| 0.7374999999999999 | 264.932 |
| 0.7381944444444444 | 260.373 |
| 0.7388888888888889 | 260.373 |
| 0.7395833333333334 | 255.813 |
| 0.7402777777777777 | 251.251 |
| 0.7409722222222223 | 242.127 |
| 0.7416666666666667 | 237.564 |
| 0.7423611111111111 | 233 |
| 0.7430555555555555 | 228.436 |
| 0.74375 | 223.873 |
| 0.7444444444444445 | 219.309 |
| 0.7451388888888889 | 214.746 |
| 0.7458333333333332 | 205.62 |
| 0.7465277777777778 | 201.058 |
| 0.7472222222222222 | 191.937 |
| 0.7479166666666667 | 187.378 |
| 0.748611111111111 | 182.82 |
| 0.7493055555555556 | 173.709 |
| 0.75 | 169.156 |
| 0.7506944444444444 | 164.605 |
| 0.751388888888889 | 155.509 |
| 0.7520833333333333 | 150.964 |
| 0.7527777777777778 | 146.423 |
| 0.7534722222222222 | 141.884 |
| 0.7541666666666668 | 141.884 |
| 0.7548611111111111 | 141.884 |
| 0.7555555555555555 | 146.423 |
| 0.75625 | 155.509 |
| 0.7569444444444445 | 160.056 |
| 0.7576388888888889 | 178.264 |
| 0.7583333333333333 | 191.937 |
| 0.7590277777777777 | 173.709 |
| 0.7597222222222223 | 173.709 |
| 0.7604166666666666 | 169.156 |
| 0.7611111111111111 | 169.156 |
| 0.7618055555555556 | 173.709 |
| 0.7625000000000001 | 178.264 |
| 0.7631944444444444 | 187.378 |
| 0.7638888888888888 | 191.937 |
| 0.7645833333333334 | 196.497 |
| 0.7652777777777778 | 201.058 |
| 0.7659722222222222 | 196.497 |
| 0.7666666666666666 | 196.497 |
| 0.7673611111111112 | 191.937 |
| 0.7680555555555556 | 182.82 |
| 0.7687499999999999 | 182.82 |
| 0.7694444444444444 | 178.264 |
| 0.7701388888888889 | 173.709 |
| 0.7708333333333334 | 178.264 |
| 0.7715277777777777 | 191.937 |
| 0.7722222222222223 | 187.378 |
| 0.7729166666666667 | 182.82 |
| 0.7736111111111111 | 173.709 |
| 0.7743055555555555 | 173.709 |
| 0.775 | 173.709 |
| 0.7756944444444445 | 169.156 |
| 0.7763888888888889 | 164.605 |
| 0.7770833333333332 | 155.509 |
| 0.7777777777777778 | 150.964 |
| 0.7784722222222222 | 146.423 |
| 0.7791666666666667 | 137.347 |
| 0.779861111111111 | 132.814 |
| 0.7805555555555556 | 123.758 |
| 0.78125 | 119.235 |
| 0.7819444444444444 | 110.201 |
| 0.782638888888889 | 101.184 |
| 0.7833333333333333 | 96.682 |
| 0.7840277777777778 | 92.184 |
| 0.7847222222222222 | 87.692 |
| 0.7854166666666668 | 83.205 |
| 0.7861111111111111 | 83.205 |
| 0.7868055555555555 | 78.722 |
| 0.7875 | 78.722 |
| 0.7881944444444445 | 78.722 |
| 0.7888888888888889 | 78.722 |
| 0.7895833333333333 | 74.246 |
| 0.7902777777777777 | 74.246 |
| 0.7909722222222223 | 74.246 |
| 0.7916666666666666 | 74.246 |
| 0.7923611111111111 | 74.246 |
| 0.7930555555555556 | 69.775 |
| 0.7937500000000001 | 69.775 |
| 0.7944444444444444 | 65.31 |
| 0.7951388888888888 | 65.31 |
| 0.7958333333333334 | 65.31 |
| 0.7965277777777778 | 65.31 |
| 0.7972222222222222 | 65.31 |
| 0.7979166666666666 | 60.85 |
| 0.7986111111111112 | 60.85 |
| 0.7993055555555556 | 60.85 |
| 0.7999999999999999 | 60.85 |
| 0.8006944444444444 | 60.85 |
| 0.8013888888888889 | 56.398 |
| 0.8020833333333334 | 56.398 |
| 0.8027777777777777 | 56.398 |
| 0.8034722222222223 | 56.398 |
| 0.8041666666666667 | 56.398 |
| 0.8048611111111111 | 56.398 |
| 0.8055555555555555 | 56.398 |
| 0.80625 | 56.398 |
| 0.8069444444444445 | 56.398 |
| 0.8076388888888889 | 56.398 |
| 0.8083333333333332 | 56.398 |
| 0.8090277777777778 | 56.398 |
| 0.8097222222222222 | 56.398 |
| 0.8104166666666667 | 51.951 |
| 0.811111111111111 | 51.951 |
| 0.8118055555555556 | 51.951 |
| 0.8125 | 47.511 |
| 0.8131944444444444 | 47.511 |
| 0.813888888888889 | 43.079 |
| 0.8145833333333333 | 43.079 |
| 0.8152777777777778 | 38.653 |
| 0.8159722222222222 | 38.653 |
| 0.8166666666666668 | 38.653 |
| 0.8173611111111111 | 34.234 |
| 0.8180555555555555 | 34.234 |
| 0.81875 | 29.823 |
| 0.8194444444444445 | 29.823 |
| 0.8201388888888889 | 29.823 |
| 0.8208333333333333 | 25.419 |
| 0.8215277777777777 | 25.419 |
| 0.8222222222222223 | 25.419 |
| 0.8229166666666666 | 21.024 |
| 0.8236111111111111 | 21.024 |
| 0.8243055555555556 | 21.024 |
| 0.8250000000000001 | 21.024 |
| 0.8256944444444444 | 21.024 |
| 0.8263888888888888 | 16.636 |
| 0.8270833333333334 | 16.636 |
| 0.8277777777777778 | 12.257 |
| 0.8284722222222222 | 12.257 |
| 0.8291666666666666 | 12.257 |
| 0.8298611111111112 | 12.257 |
| 0.8305555555555556 | 7.887 |
| 0.8312499999999999 | 7.887 |
| 0.8319444444444444 | 7.887 |
| 0.8326388888888889 | 7.887 |
| 0.8333333333333334 | 7.887 |
| 0.8340277777777777 | 7.887 |
| 0.8347222222222223 | 3.525 |
| 0.8354166666666667 | 3.525 |
| 0.8361111111111111 | 3.525 |
| 0.8368055555555555 | 3.525 |
| 0.8375 | 3.525 |
| 0.8381944444444445 | 3.525 |
| 0.8388888888888889 | 3.525 |
| 0.8395833333333332 | 3.525 |
| 0.8402777777777778 | 0 |
| 0.8409722222222222 | 0 |
| 0.8416666666666667 | 0 |
| 0.842361111111111 | 0 |
| 0.8430555555555556 | 0 |
| 0.84375 | 0 |
| 0.8444444444444444 | 0 |
| 0.845138888888889 | 0 |
| 0.8458333333333333 | 0 |
| 0.8465277777777778 | 0 |
| 0.8472222222222222 | 0 |
| 0.8479166666666668 | 0 |
| 0.8486111111111111 | 0 |
| 0.8493055555555555 | 0 |
| 0.85 | 0 |
| 0.8506944444444445 | 0 |
| 0.8513888888888889 | 0 |
| 0.8520833333333333 | 0 |
| 0.8527777777777777 | 0 |
| 0.8534722222222223 | 0 |
| 0.8541666666666666 | 0 |
| 0.8548611111111111 | 0 |
| 0.8555555555555556 | 0 |
| 0.8562500000000001 | 0 |
| 0.8569444444444444 | 0 |
| 0.8576388888888888 | 0 |
| 0.8583333333333334 | 0 |
| 0.8590277777777778 | 0 |
| 0.8597222222222222 | 0 |
| 0.8604166666666666 | 0 |
| 0.8611111111111112 | 0 |
| 0.8618055555555556 | 0 |
| 0.8624999999999999 | 0 |
| 0.8631944444444444 | 0 |
| 0.8638888888888889 | 0 |
| 0.8645833333333334 | 0 |
| 0.8652777777777777 | 0 |
| 0.8659722222222223 | 0 |
| 0.8666666666666667 | 0 |
| 0.8673611111111111 | 0 |
| 0.8680555555555555 | 0 |
| 0.86875 | 0 |
| 0.8694444444444445 | 0 |
| 0.8701388888888889 | 0 |
| 0.8708333333333332 | 0 |
| 0.8715277777777778 | 0 |
| 0.8722222222222222 | 0 |
| 0.8729166666666667 | 0 |
| 0.873611111111111 | 0 |
| 0.8743055555555556 | 0 |
| 0.875 | 0 |
| 0.8756944444444444 | 0 |
| 0.876388888888889 | 0 |
| 0.8770833333333333 | 0 |
| 0.8777777777777778 | 0 |
| 0.8784722222222222 | 0 |
| 0.8791666666666668 | 0 |
| 0.8798611111111111 | 0 |
| 0.8805555555555555 | 0 |
| 0.88125 | 0 |
| 0.8819444444444445 | 0 |
| 0.8826388888888889 | 0 |
| 0.8833333333333333 | 0 |
| 0.8840277777777777 | 0 |
| 0.8847222222222223 | 0 |
| 0.8854166666666666 | 0 |
| 0.8861111111111111 | 0 |
| 0.8868055555555556 | 0 |
| 0.8875000000000001 | 0 |
| 0.8881944444444444 | 0 |
| 0.8888888888888888 | 0 |
| 0.8895833333333334 | 0 |
| 0.8902777777777778 | 0 |
| 0.8909722222222222 | 0 |
| 0.8916666666666666 | 0 |
| 0.8923611111111112 | 0 |
| 0.8930555555555556 | 0 |
| 0.8937499999999999 | 0 |
| 0.8944444444444444 | 0 |
| 0.8951388888888889 | 0 |
| 0.8958333333333334 | 0 |
| 0.8965277777777777 | 0 |
| 0.8972222222222223 | 0 |
| 0.8979166666666667 | 0 |
| 0.8986111111111111 | 0 |
| 0.8993055555555555 | 0 |
| 0.9 | 0 |
| 0.9006944444444445 | 0 |
| 0.9013888888888889 | 0 |
| 0.9020833333333332 | 0 |
| 0.9027777777777778 | 0 |
| 0.9034722222222222 | 0 |
| 0.9041666666666667 | 0 |
| 0.904861111111111 | 0 |
| 0.9055555555555556 | 0 |
| 0.90625 | 0 |
| 0.9069444444444444 | 0 |
| 0.907638888888889 | 0 |
| 0.9083333333333333 | 0 |
| 0.9090277777777778 | 0 |
| 0.9097222222222222 | 0 |
| 0.9104166666666668 | 0 |
| 0.9111111111111111 | 0 |
| 0.9118055555555555 | 0 |
| 0.9125 | 0 |
| 0.9131944444444445 | 0 |
| 0.9138888888888889 | 0 |
| 0.9145833333333333 | 0 |
| 0.9152777777777777 | 0 |
| 0.9159722222222223 | 0 |
| 0.9166666666666666 | 0 |
| 0.9173611111111111 | 0 |
| 0.9180555555555556 | 0 |
| 0.9187500000000001 | 0 |
| 0.9194444444444444 | 0 |
| 0.9201388888888888 | 0 |
| 0.9208333333333334 | 0 |
| 0.9215277777777778 | 0 |
| 0.9222222222222222 | 0 |
| 0.9229166666666666 | 0 |
| 0.9236111111111112 | 0 |
| 0.9243055555555556 | 0 |
| 0.9249999999999999 | 0 |
| 0.9256944444444444 | 0 |
| 0.9263888888888889 | 0 |
| 0.9270833333333334 | 0 |
| 0.9277777777777777 | 0 |
| 0.9284722222222223 | 0 |
| 0.9291666666666667 | 0 |
| 0.9298611111111111 | 0 |
| 0.9305555555555555 | 0 |
| 0.93125 | 0 |
| 0.9319444444444445 | 0 |
| 0.9326388888888889 | 0 |
| 0.9333333333333332 | 0 |
| 0.9340277777777778 | 0 |
| 0.9347222222222222 | 0 |
| 0.9354166666666667 | 0 |
| 0.936111111111111 | 0 |
| 0.9368055555555556 | 0 |
| 0.9375 | 0 |
| 0.9381944444444444 | 0 |
| 0.938888888888889 | 0 |
| 0.9395833333333333 | 0 |
| 0.9402777777777778 | 0 |
| 0.9409722222222222 | 0 |
| 0.9416666666666668 | 0 |
| 0.9423611111111111 | 0 |
| 0.9430555555555555 | 0 |
| 0.94375 | 0 |
| 0.9444444444444445 | 0 |
| 0.9451388888888889 | 0 |
| 0.9458333333333333 | 0 |
| 0.9465277777777777 | 0 |
| 0.9472222222222223 | 0 |
| 0.9479166666666666 | 0 |
| 0.9486111111111111 | 0 |
| 0.9493055555555556 | 0 |
| 0.9500000000000001 | 0 |
| 0.9506944444444444 | 0 |
| 0.9513888888888888 | 0 |
| 0.9520833333333334 | 0 |
| 0.9527777777777778 | 0 |
| 0.9534722222222222 | 0 |
| 0.9541666666666666 | 0 |
| 0.9548611111111112 | 0 |
| 0.9555555555555556 | 0 |
| 0.9562499999999999 | 0 |
| 0.9569444444444444 | 0 |
| 0.9576388888888889 | 0 |
| 0.9583333333333334 | 0 |
| 0.9590277777777777 | 0 |
| 0.9597222222222223 | 0 |
| 0.9604166666666667 | 0 |
| 0.9611111111111111 | 0 |
| 0.9618055555555555 | 0 |
| 0.9625 | 0 |
| 0.9631944444444445 | 0 |
| 0.9638888888888889 | 0 |
| 0.9645833333333332 | 0 |
| 0.9652777777777778 | 0 |
| 0.9659722222222222 | 0 |
| 0.9666666666666667 | 0 |
| 0.967361111111111 | 0 |
| 0.9680555555555556 | 0 |
| 0.96875 | 0 |
| 0.9694444444444444 | 0 |
| 0.970138888888889 | 0 |
| 0.9708333333333333 | 0 |
| 0.9715277777777778 | 0 |
| 0.9722222222222222 | 0 |
| 0.9729166666666668 | 0 |
| 0.9736111111111111 | 0 |
| 0.9743055555555555 | 0 |
| 0.975 | 0 |
| 0.9756944444444445 | 0 |
| 0.9763888888888889 | 0 |
| 0.9770833333333333 | 0 |
| 0.9777777777777777 | 0 |
| 0.9784722222222223 | 0 |
| 0.9791666666666666 | 0 |
| 0.9798611111111111 | 0 |
| 0.9805555555555556 | 0 |
| 0.9812500000000001 | 0 |
| 0.9819444444444444 | 0 |
| 0.9826388888888888 | 0 |
| 0.9833333333333334 | 0 |
| 0.9840277777777778 | 0 |
| 0.9847222222222222 | 0 |
| 0.9854166666666666 | 0 |
| 0.9861111111111112 | 0 |
| 0.9868055555555556 | 0 |
| 0.9874999999999999 | 0 |
| 0.9881944444444444 | 0 |
| 0.9888888888888889 | 0 |
| 0.9895833333333334 | 0 |
| 0.9902777777777777 | 0 |
| 0.9909722222222223 | 0 |
| 0.9916666666666667 | 0 |
| 0.9923611111111111 | 0 |
| 0.9930555555555555 | 0 |
| 0.99375 | 0 |
| 0.9944444444444445 | 0 |
| 0.9951388888888889 | 0 |
| 0.9958333333333332 | 0 |
| 0.9965277777777778 | 0 |
| 0.9972222222222222 | 0 |
| 0.9979166666666667 | 0 |
| 0.998611111111111 | 0 |
| 0.9993055555555556 | 0 |